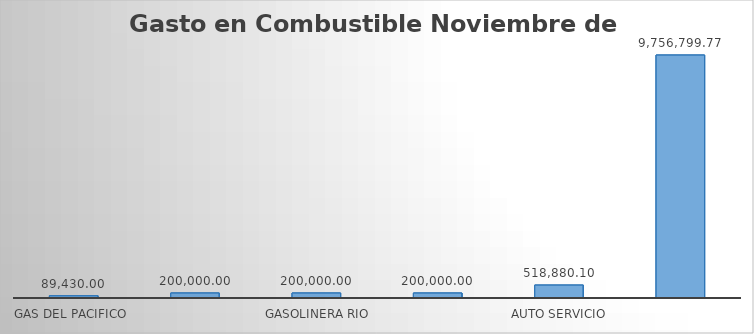
| Category | Suma  |
|---|---|
| GAS DEL PACIFICO  | 89430 |
| GASOLINERA EL CARRIZO  | 200000 |
| GASOLINERA RIO SINALOA | 200000 |
| SERVICIOS DEL CERRO DE LA MEMORIA  | 200000 |
| AUTO SERVICIO DEGOLLADO | 518880.1 |
| SERVICIOS DEL VALLE DEL FUERTE  | 9756799.77 |